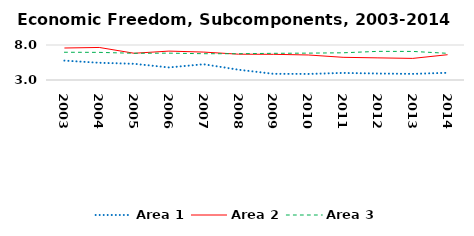
| Category | Area 1 | Area 2 | Area 3 |
|---|---|---|---|
| 2003.0 | 5.773 | 7.57 | 6.965 |
| 2004.0 | 5.459 | 7.647 | 6.947 |
| 2005.0 | 5.316 | 6.82 | 6.815 |
| 2006.0 | 4.795 | 7.129 | 6.836 |
| 2007.0 | 5.248 | 6.989 | 6.756 |
| 2008.0 | 4.469 | 6.687 | 6.755 |
| 2009.0 | 3.883 | 6.669 | 6.81 |
| 2010.0 | 3.866 | 6.575 | 6.839 |
| 2011.0 | 4.011 | 6.24 | 6.886 |
| 2012.0 | 3.924 | 6.162 | 7.091 |
| 2013.0 | 3.874 | 6.085 | 7.081 |
| 2014.0 | 4.029 | 6.614 | 6.812 |